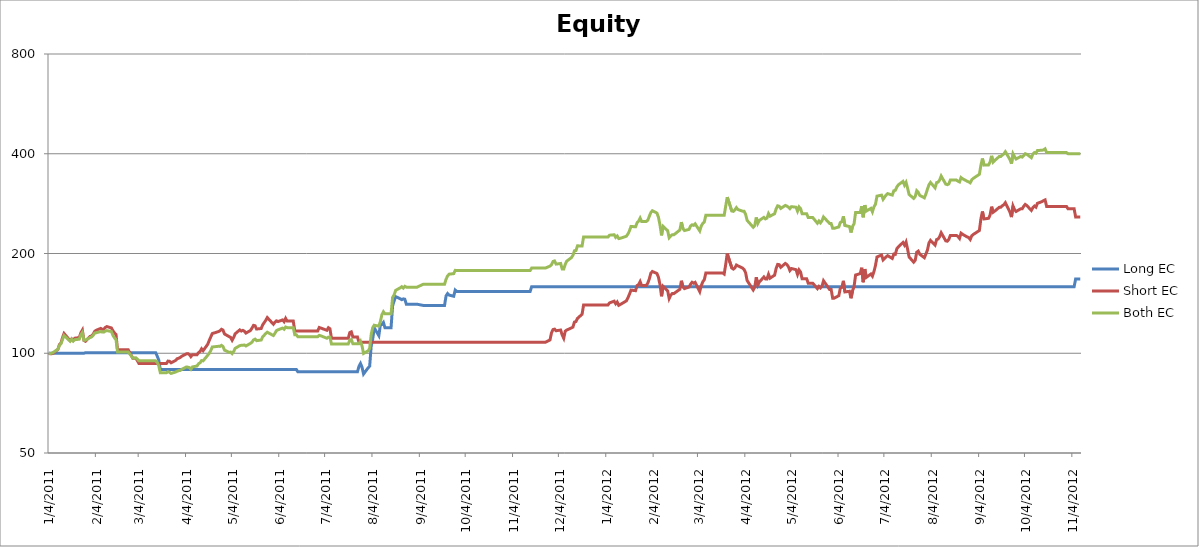
| Category | Long EC | Short EC | Both EC |
|---|---|---|---|
| 2011-01-04 | 100 | 100 | 100 |
| 2011-01-05 | 100 | 99.639 | 99.834 |
| 2011-01-06 | 100 | 99.675 | 100.065 |
| 2011-01-07 | 100 | 100.115 | 100.629 |
| 2011-01-10 | 100 | 102.716 | 102.89 |
| 2011-01-11 | 100 | 106.32 | 105.572 |
| 2011-01-12 | 100 | 107.437 | 106.851 |
| 2011-01-13 | 100 | 111.402 | 110.026 |
| 2011-01-14 | 100 | 114.733 | 113.123 |
| 2011-01-18 | 100 | 109.132 | 108.713 |
| 2011-01-19 | 100 | 110.538 | 110.254 |
| 2011-01-20 | 100 | 109.337 | 108.807 |
| 2011-01-21 | 100 | 111.011 | 109.857 |
| 2011-01-24 | 100 | 111.498 | 110.278 |
| 2011-01-25 | 100 | 115.309 | 113.622 |
| 2011-01-26 | 100 | 117.448 | 115.449 |
| 2011-01-27 | 100 | 109.354 | 109.508 |
| 2011-01-28 | 100.352 | 108.688 | 109.508 |
| 2011-01-31 | 100.352 | 112.401 | 111.503 |
| 2011-02-01 | 100.352 | 112.692 | 112.004 |
| 2011-02-02 | 100.352 | 114.077 | 113.132 |
| 2011-02-03 | 100.352 | 116.316 | 115.03 |
| 2011-02-04 | 100.352 | 117.295 | 115.279 |
| 2011-02-07 | 100.352 | 118.84 | 116.273 |
| 2011-02-08 | 100.352 | 118.113 | 115.825 |
| 2011-02-09 | 100.352 | 118.144 | 115.81 |
| 2011-02-10 | 100.352 | 119.668 | 116.615 |
| 2011-02-11 | 100.352 | 120.372 | 117.019 |
| 2011-02-14 | 100.352 | 119.232 | 116.283 |
| 2011-02-15 | 100.352 | 116.865 | 113.232 |
| 2011-02-16 | 100.352 | 115.23 | 111.315 |
| 2011-02-17 | 100.352 | 114.006 | 109.9 |
| 2011-02-18 | 100.352 | 102.388 | 100.902 |
| 2011-02-22 | 100.352 | 102.388 | 100.902 |
| 2011-02-23 | 100.352 | 102.388 | 100.902 |
| 2011-02-24 | 100.352 | 102.388 | 100.902 |
| 2011-02-25 | 100.352 | 102.388 | 100.902 |
| 2011-02-28 | 100.352 | 96.541 | 96.82 |
| 2011-03-01 | 100.352 | 96.541 | 96.82 |
| 2011-03-02 | 100.352 | 96.541 | 96.82 |
| 2011-03-03 | 100.352 | 95.003 | 96.007 |
| 2011-03-04 | 100.352 | 93.107 | 94.843 |
| 2011-03-07 | 100.352 | 93.107 | 94.843 |
| 2011-03-08 | 100.352 | 93.107 | 94.843 |
| 2011-03-09 | 100.352 | 93.107 | 94.843 |
| 2011-03-10 | 100.352 | 93.107 | 94.843 |
| 2011-03-11 | 100.352 | 93.107 | 94.843 |
| 2011-03-14 | 100.352 | 93.107 | 94.843 |
| 2011-03-15 | 100.352 | 93.107 | 94.843 |
| 2011-03-16 | 97.938 | 93.107 | 93.822 |
| 2011-03-17 | 95.34 | 93.107 | 91.668 |
| 2011-03-18 | 89.361 | 93.107 | 87.341 |
| 2011-03-21 | 89.361 | 93.107 | 87.341 |
| 2011-03-22 | 89.361 | 93.107 | 87.341 |
| 2011-03-23 | 89.361 | 94.689 | 87.991 |
| 2011-03-24 | 89.361 | 94.545 | 87.594 |
| 2011-03-25 | 89.361 | 93.59 | 86.922 |
| 2011-03-28 | 89.361 | 95.123 | 87.757 |
| 2011-03-29 | 89.361 | 96.273 | 88.214 |
| 2011-03-30 | 89.361 | 96.607 | 88.636 |
| 2011-03-31 | 89.361 | 97.099 | 88.715 |
| 2011-04-01 | 89.361 | 97.918 | 89.394 |
| 2011-04-04 | 89.361 | 99.575 | 90.914 |
| 2011-04-05 | 89.361 | 99.747 | 90.79 |
| 2011-04-06 | 89.361 | 99.179 | 90.504 |
| 2011-04-07 | 89.361 | 97.662 | 89.428 |
| 2011-04-08 | 89.361 | 98.992 | 90.917 |
| 2011-04-11 | 89.361 | 98.903 | 91.515 |
| 2011-04-12 | 89.361 | 100.443 | 92.947 |
| 2011-04-13 | 89.361 | 101.2 | 93.574 |
| 2011-04-14 | 89.361 | 103.132 | 95.023 |
| 2011-04-15 | 89.361 | 101.787 | 94.846 |
| 2011-04-18 | 89.361 | 106.399 | 98.604 |
| 2011-04-19 | 89.361 | 109.27 | 99.916 |
| 2011-04-20 | 89.361 | 111.947 | 101.853 |
| 2011-04-21 | 89.361 | 114.671 | 104.442 |
| 2011-04-25 | 89.361 | 116.217 | 104.947 |
| 2011-04-26 | 89.361 | 116.889 | 104.87 |
| 2011-04-27 | 89.361 | 118.129 | 105.639 |
| 2011-04-28 | 89.361 | 117.514 | 104.842 |
| 2011-04-29 | 89.361 | 114.341 | 102.178 |
| 2011-05-02 | 89.361 | 112.258 | 100.68 |
| 2011-05-03 | 89.361 | 111.65 | 100.8 |
| 2011-05-04 | 89.361 | 109.471 | 99.751 |
| 2011-05-05 | 89.361 | 111.589 | 101.234 |
| 2011-05-06 | 89.361 | 114.508 | 103.493 |
| 2011-05-09 | 89.361 | 117.619 | 105.425 |
| 2011-05-10 | 89.361 | 116.691 | 105.698 |
| 2011-05-11 | 89.361 | 117.228 | 105.681 |
| 2011-05-12 | 89.361 | 116.57 | 105.904 |
| 2011-05-13 | 89.361 | 115.047 | 105.188 |
| 2011-05-16 | 89.361 | 117.132 | 107.11 |
| 2011-05-17 | 89.361 | 119.12 | 107.974 |
| 2011-05-18 | 89.361 | 121.363 | 109.751 |
| 2011-05-19 | 89.361 | 121.035 | 110.329 |
| 2011-05-20 | 89.361 | 118.316 | 109.128 |
| 2011-05-23 | 89.361 | 118.765 | 109.636 |
| 2011-05-24 | 89.361 | 121.845 | 112.11 |
| 2011-05-25 | 89.361 | 123.781 | 113.376 |
| 2011-05-26 | 89.361 | 125.717 | 114.71 |
| 2011-05-27 | 89.361 | 128.129 | 115.723 |
| 2011-05-31 | 89.361 | 122.354 | 113.1 |
| 2011-06-01 | 89.361 | 124.092 | 114.83 |
| 2011-06-02 | 89.361 | 125.256 | 117.05 |
| 2011-06-03 | 89.361 | 124.61 | 117.688 |
| 2011-06-06 | 89.361 | 126.034 | 119.098 |
| 2011-06-07 | 89.361 | 124.501 | 118.154 |
| 2011-06-08 | 89.361 | 127.417 | 120.02 |
| 2011-06-09 | 89.361 | 125.063 | 119.468 |
| 2011-06-10 | 89.361 | 125.063 | 119.468 |
| 2011-06-13 | 89.361 | 125.063 | 119.468 |
| 2011-06-14 | 89.361 | 116.813 | 113.712 |
| 2011-06-15 | 89.361 | 116.813 | 113.712 |
| 2011-06-16 | 87.897 | 116.813 | 112.19 |
| 2011-06-17 | 87.897 | 116.813 | 112.19 |
| 2011-06-20 | 87.897 | 116.813 | 112.19 |
| 2011-06-21 | 87.897 | 116.813 | 112.19 |
| 2011-06-22 | 87.897 | 116.813 | 112.19 |
| 2011-06-23 | 87.897 | 116.813 | 112.19 |
| 2011-06-24 | 87.897 | 116.813 | 112.19 |
| 2011-06-27 | 87.897 | 116.813 | 112.19 |
| 2011-06-28 | 87.897 | 116.813 | 112.19 |
| 2011-06-29 | 87.897 | 116.813 | 112.19 |
| 2011-06-30 | 87.897 | 119.621 | 113.229 |
| 2011-07-01 | 87.897 | 119.155 | 112.884 |
| 2011-07-05 | 87.897 | 117.307 | 110.995 |
| 2011-07-06 | 87.897 | 119.429 | 111.854 |
| 2011-07-07 | 87.897 | 118.527 | 111.798 |
| 2011-07-08 | 87.897 | 110.947 | 106.673 |
| 2011-07-11 | 87.897 | 110.947 | 106.673 |
| 2011-07-12 | 87.897 | 110.947 | 106.673 |
| 2011-07-13 | 87.897 | 110.947 | 106.673 |
| 2011-07-14 | 87.897 | 110.947 | 106.673 |
| 2011-07-15 | 87.897 | 110.947 | 106.673 |
| 2011-07-18 | 87.897 | 110.947 | 106.673 |
| 2011-07-19 | 87.897 | 110.947 | 106.673 |
| 2011-07-20 | 87.897 | 115.484 | 109.557 |
| 2011-07-21 | 87.897 | 116.043 | 110.011 |
| 2011-07-22 | 87.897 | 112.037 | 106.827 |
| 2011-07-25 | 87.897 | 112.037 | 106.827 |
| 2011-07-26 | 91.297 | 107.915 | 106.827 |
| 2011-07-27 | 93.136 | 107.915 | 108.668 |
| 2011-07-28 | 90.768 | 107.915 | 105.168 |
| 2011-07-29 | 86.569 | 107.915 | 99.852 |
| 2011-08-01 | 90.371 | 107.915 | 101.69 |
| 2011-08-02 | 91.4 | 107.915 | 103.398 |
| 2011-08-03 | 105.095 | 107.915 | 114.043 |
| 2011-08-04 | 110.306 | 107.915 | 119.533 |
| 2011-08-05 | 119.275 | 107.915 | 121.464 |
| 2011-08-08 | 113.022 | 107.915 | 120.751 |
| 2011-08-09 | 121.643 | 107.915 | 124.621 |
| 2011-08-10 | 122.144 | 107.915 | 130.73 |
| 2011-08-11 | 123.841 | 107.915 | 133.427 |
| 2011-08-12 | 119.454 | 107.915 | 131.519 |
| 2011-08-15 | 119.454 | 107.915 | 131.519 |
| 2011-08-16 | 119.454 | 107.915 | 131.519 |
| 2011-08-17 | 138.999 | 107.915 | 147.362 |
| 2011-08-18 | 143.748 | 107.915 | 149.992 |
| 2011-08-19 | 148.241 | 107.915 | 154.803 |
| 2011-08-22 | 146.028 | 107.915 | 157.581 |
| 2011-08-23 | 145.123 | 107.915 | 158.828 |
| 2011-08-24 | 145.906 | 107.915 | 157.268 |
| 2011-08-25 | 145.56 | 107.915 | 159.173 |
| 2011-08-26 | 140.589 | 107.915 | 158.308 |
| 2011-08-29 | 140.589 | 107.915 | 158.308 |
| 2011-08-30 | 140.589 | 107.915 | 158.308 |
| 2011-08-31 | 140.589 | 107.915 | 158.308 |
| 2011-09-01 | 140.589 | 107.915 | 158.308 |
| 2011-09-02 | 140.589 | 107.915 | 158.308 |
| 2011-09-06 | 139.443 | 107.915 | 161.477 |
| 2011-09-07 | 139.443 | 107.915 | 161.477 |
| 2011-09-08 | 139.443 | 107.915 | 161.477 |
| 2011-09-09 | 139.443 | 107.915 | 161.477 |
| 2011-09-12 | 139.443 | 107.915 | 161.477 |
| 2011-09-13 | 139.443 | 107.915 | 161.477 |
| 2011-09-14 | 139.443 | 107.915 | 161.477 |
| 2011-09-15 | 139.443 | 107.915 | 161.477 |
| 2011-09-16 | 139.443 | 107.915 | 161.477 |
| 2011-09-19 | 139.443 | 107.915 | 161.477 |
| 2011-09-20 | 139.443 | 107.915 | 161.477 |
| 2011-09-21 | 149.007 | 107.915 | 167.334 |
| 2011-09-22 | 151.447 | 107.915 | 171.089 |
| 2011-09-23 | 149.775 | 107.915 | 173.264 |
| 2011-09-26 | 148.624 | 107.915 | 173.881 |
| 2011-09-27 | 155.082 | 107.915 | 177.885 |
| 2011-09-28 | 153.593 | 107.915 | 177.582 |
| 2011-09-29 | 153.593 | 107.915 | 177.582 |
| 2011-09-30 | 153.593 | 107.915 | 177.582 |
| 2011-10-03 | 153.593 | 107.915 | 177.582 |
| 2011-10-04 | 153.593 | 107.915 | 177.582 |
| 2011-10-05 | 153.593 | 107.915 | 177.582 |
| 2011-10-06 | 153.593 | 107.915 | 177.582 |
| 2011-10-07 | 153.593 | 107.915 | 177.582 |
| 2011-10-10 | 153.593 | 107.915 | 177.582 |
| 2011-10-11 | 153.593 | 107.915 | 177.582 |
| 2011-10-12 | 153.593 | 107.915 | 177.582 |
| 2011-10-13 | 153.593 | 107.915 | 177.582 |
| 2011-10-14 | 153.593 | 107.915 | 177.582 |
| 2011-10-17 | 153.593 | 107.915 | 177.582 |
| 2011-10-18 | 153.593 | 107.915 | 177.582 |
| 2011-10-19 | 153.593 | 107.915 | 177.582 |
| 2011-10-20 | 153.593 | 107.915 | 177.582 |
| 2011-10-21 | 153.593 | 107.915 | 177.582 |
| 2011-10-24 | 153.593 | 107.915 | 177.582 |
| 2011-10-25 | 153.593 | 107.915 | 177.582 |
| 2011-10-26 | 153.593 | 107.915 | 177.582 |
| 2011-10-27 | 153.593 | 107.915 | 177.582 |
| 2011-10-28 | 153.593 | 107.915 | 177.582 |
| 2011-10-31 | 153.593 | 107.915 | 177.582 |
| 2011-11-01 | 153.593 | 107.915 | 177.582 |
| 2011-11-02 | 153.593 | 107.915 | 177.582 |
| 2011-11-03 | 153.593 | 107.915 | 177.582 |
| 2011-11-04 | 153.593 | 107.915 | 177.582 |
| 2011-11-07 | 153.593 | 107.915 | 177.582 |
| 2011-11-08 | 153.593 | 107.915 | 177.582 |
| 2011-11-09 | 153.593 | 107.915 | 177.582 |
| 2011-11-10 | 153.593 | 107.915 | 177.582 |
| 2011-11-11 | 153.593 | 107.915 | 177.582 |
| 2011-11-14 | 153.593 | 107.915 | 177.582 |
| 2011-11-15 | 153.593 | 107.915 | 177.582 |
| 2011-11-16 | 158.768 | 107.915 | 180.744 |
| 2011-11-17 | 158.768 | 107.915 | 180.744 |
| 2011-11-18 | 158.768 | 107.915 | 180.744 |
| 2011-11-21 | 158.768 | 107.915 | 180.744 |
| 2011-11-22 | 158.768 | 107.915 | 180.744 |
| 2011-11-23 | 158.768 | 107.915 | 180.744 |
| 2011-11-25 | 158.768 | 107.915 | 180.744 |
| 2011-11-28 | 158.768 | 109.714 | 183.249 |
| 2011-11-29 | 158.768 | 115.266 | 184.975 |
| 2011-11-30 | 158.768 | 117.909 | 189.247 |
| 2011-12-01 | 158.768 | 118.217 | 189.911 |
| 2011-12-02 | 158.768 | 116.93 | 185.779 |
| 2011-12-05 | 158.768 | 117.492 | 186.611 |
| 2011-12-06 | 158.768 | 113.458 | 179.51 |
| 2011-12-07 | 158.768 | 110.969 | 179.507 |
| 2011-12-08 | 158.768 | 116.619 | 185.599 |
| 2011-12-09 | 158.768 | 117.519 | 189.738 |
| 2011-12-12 | 158.768 | 119.23 | 194.28 |
| 2011-12-13 | 158.768 | 119.882 | 197.405 |
| 2011-12-14 | 158.768 | 124.22 | 203.836 |
| 2011-12-15 | 158.768 | 124.653 | 204.24 |
| 2011-12-16 | 158.768 | 127.429 | 210.972 |
| 2011-12-19 | 158.768 | 131.088 | 210.657 |
| 2011-12-20 | 158.768 | 139.948 | 224.48 |
| 2011-12-21 | 158.768 | 139.948 | 224.48 |
| 2011-12-22 | 158.768 | 139.948 | 224.48 |
| 2011-12-23 | 158.768 | 139.948 | 224.48 |
| 2011-12-27 | 158.768 | 139.948 | 224.48 |
| 2011-12-28 | 158.768 | 139.948 | 224.48 |
| 2011-12-29 | 158.768 | 139.948 | 224.48 |
| 2011-12-30 | 158.768 | 139.948 | 224.48 |
| 2012-01-03 | 158.768 | 139.948 | 224.48 |
| 2012-01-04 | 158.768 | 139.948 | 224.48 |
| 2012-01-05 | 158.768 | 139.948 | 224.48 |
| 2012-01-06 | 158.768 | 141.931 | 227.125 |
| 2012-01-09 | 158.768 | 143.593 | 227.822 |
| 2012-01-10 | 158.768 | 141.031 | 223.633 |
| 2012-01-11 | 158.768 | 142.787 | 225.873 |
| 2012-01-12 | 158.768 | 139.528 | 221.885 |
| 2012-01-13 | 158.768 | 140.329 | 222.303 |
| 2012-01-17 | 158.768 | 143.924 | 225.538 |
| 2012-01-18 | 158.768 | 146.937 | 229.069 |
| 2012-01-19 | 158.768 | 150.709 | 234.1 |
| 2012-01-20 | 158.768 | 155.018 | 241.388 |
| 2012-01-23 | 158.768 | 154.447 | 240.779 |
| 2012-01-24 | 158.768 | 160.103 | 247.588 |
| 2012-01-25 | 158.768 | 161.111 | 250.417 |
| 2012-01-26 | 158.768 | 164.541 | 255.845 |
| 2012-01-27 | 158.768 | 160.057 | 249.759 |
| 2012-01-30 | 158.768 | 160.119 | 249.952 |
| 2012-01-31 | 158.768 | 162.842 | 252.001 |
| 2012-02-01 | 158.768 | 167.623 | 259.014 |
| 2012-02-02 | 158.768 | 174.393 | 265.848 |
| 2012-02-03 | 158.768 | 176.517 | 269.247 |
| 2012-02-06 | 158.768 | 174.057 | 264.824 |
| 2012-02-07 | 158.768 | 169.502 | 257.095 |
| 2012-02-08 | 158.768 | 160.896 | 243.734 |
| 2012-02-09 | 158.768 | 148.579 | 226.867 |
| 2012-02-10 | 158.768 | 159.248 | 241.477 |
| 2012-02-13 | 158.768 | 154.326 | 234.303 |
| 2012-02-14 | 158.768 | 146.279 | 223.194 |
| 2012-02-15 | 158.768 | 149.619 | 225.815 |
| 2012-02-16 | 158.768 | 151.398 | 227.895 |
| 2012-02-17 | 158.768 | 151.331 | 227.691 |
| 2012-02-21 | 158.768 | 155.994 | 235.453 |
| 2012-02-22 | 158.768 | 165.489 | 248.747 |
| 2012-02-23 | 158.768 | 158.602 | 237.841 |
| 2012-02-24 | 158.768 | 156.706 | 234.592 |
| 2012-02-27 | 158.768 | 158.418 | 236.478 |
| 2012-02-28 | 158.768 | 161.555 | 242.085 |
| 2012-02-29 | 158.768 | 163.786 | 244.173 |
| 2012-03-01 | 158.768 | 162.676 | 243.275 |
| 2012-03-02 | 158.768 | 163.698 | 245.792 |
| 2012-03-05 | 158.768 | 153.43 | 233.968 |
| 2012-03-06 | 158.768 | 159.889 | 242.178 |
| 2012-03-07 | 158.768 | 164.321 | 246.483 |
| 2012-03-08 | 158.768 | 166.761 | 249.194 |
| 2012-03-09 | 158.768 | 174.673 | 260.998 |
| 2012-03-12 | 158.768 | 174.673 | 260.998 |
| 2012-03-13 | 158.768 | 174.673 | 260.998 |
| 2012-03-14 | 158.768 | 174.673 | 260.998 |
| 2012-03-15 | 158.768 | 174.673 | 260.998 |
| 2012-03-16 | 158.768 | 174.673 | 260.998 |
| 2012-03-19 | 158.768 | 174.673 | 260.998 |
| 2012-03-20 | 158.768 | 174.673 | 260.998 |
| 2012-03-21 | 158.768 | 173.368 | 260.929 |
| 2012-03-22 | 158.768 | 185.425 | 278.242 |
| 2012-03-23 | 158.768 | 199.789 | 295.89 |
| 2012-03-26 | 158.768 | 180.812 | 268.693 |
| 2012-03-27 | 158.768 | 179.467 | 268.041 |
| 2012-03-28 | 158.768 | 180.971 | 270.73 |
| 2012-03-29 | 158.768 | 184.608 | 275.059 |
| 2012-03-30 | 158.768 | 183.558 | 271.481 |
| 2012-04-02 | 158.768 | 180.719 | 268.384 |
| 2012-04-03 | 158.768 | 178.916 | 268.376 |
| 2012-04-04 | 158.768 | 175.068 | 262.739 |
| 2012-04-05 | 158.768 | 165.813 | 251.794 |
| 2012-04-09 | 158.768 | 155.256 | 239.997 |
| 2012-04-10 | 158.768 | 158.371 | 242.867 |
| 2012-04-11 | 158.768 | 169.63 | 256.962 |
| 2012-04-12 | 158.768 | 160.774 | 246.596 |
| 2012-04-13 | 158.768 | 163.981 | 251.679 |
| 2012-04-16 | 158.768 | 169.928 | 257.076 |
| 2012-04-17 | 158.768 | 167.603 | 254.436 |
| 2012-04-18 | 158.768 | 167.45 | 255.837 |
| 2012-04-19 | 158.768 | 173.037 | 263.942 |
| 2012-04-20 | 158.768 | 168.48 | 259.214 |
| 2012-04-23 | 158.768 | 172.034 | 263.685 |
| 2012-04-24 | 158.768 | 180.373 | 272.857 |
| 2012-04-25 | 158.768 | 185.388 | 278.543 |
| 2012-04-26 | 158.768 | 185.094 | 277.659 |
| 2012-04-27 | 158.768 | 181.677 | 273.553 |
| 2012-04-30 | 158.768 | 186.64 | 279.325 |
| 2012-05-01 | 158.768 | 185.221 | 278.025 |
| 2012-05-02 | 158.768 | 182.536 | 276.116 |
| 2012-05-03 | 158.768 | 177.687 | 273.249 |
| 2012-05-04 | 158.768 | 180.201 | 276.914 |
| 2012-05-07 | 158.768 | 178.755 | 275.814 |
| 2012-05-08 | 158.768 | 172.944 | 268.481 |
| 2012-05-09 | 158.768 | 178.395 | 276.384 |
| 2012-05-10 | 158.768 | 175.803 | 273.211 |
| 2012-05-11 | 158.768 | 167.678 | 263.597 |
| 2012-05-14 | 158.768 | 167.678 | 263.597 |
| 2012-05-15 | 158.768 | 162.62 | 256.664 |
| 2012-05-16 | 158.768 | 162.62 | 256.664 |
| 2012-05-17 | 158.768 | 162.62 | 256.664 |
| 2012-05-18 | 158.768 | 162.62 | 256.664 |
| 2012-05-21 | 158.768 | 156.673 | 246.825 |
| 2012-05-22 | 158.768 | 159.157 | 250.607 |
| 2012-05-23 | 158.768 | 157.472 | 247.456 |
| 2012-05-24 | 158.768 | 159.354 | 251.226 |
| 2012-05-25 | 158.768 | 165.482 | 257.849 |
| 2012-05-29 | 158.768 | 155.688 | 246.331 |
| 2012-05-30 | 158.768 | 155.688 | 246.331 |
| 2012-05-31 | 158.768 | 146.654 | 238.247 |
| 2012-06-01 | 158.768 | 146.654 | 238.247 |
| 2012-06-04 | 158.768 | 149.179 | 240.545 |
| 2012-06-05 | 158.768 | 157.17 | 248.025 |
| 2012-06-06 | 158.768 | 158.084 | 249.314 |
| 2012-06-07 | 158.768 | 165.402 | 258.873 |
| 2012-06-08 | 158.768 | 153.146 | 242.972 |
| 2012-06-11 | 158.768 | 153.76 | 241.163 |
| 2012-06-12 | 158.768 | 146.544 | 231.384 |
| 2012-06-13 | 158.768 | 154.418 | 241.356 |
| 2012-06-14 | 158.768 | 159.009 | 246.066 |
| 2012-06-15 | 158.768 | 172.239 | 266.06 |
| 2012-06-18 | 158.768 | 173.874 | 266.017 |
| 2012-06-19 | 158.768 | 181.177 | 277.625 |
| 2012-06-20 | 158.768 | 163.817 | 257.245 |
| 2012-06-21 | 158.768 | 179.496 | 279.894 |
| 2012-06-22 | 158.768 | 169.388 | 268.623 |
| 2012-06-25 | 158.768 | 173.445 | 273.699 |
| 2012-06-26 | 158.768 | 170.874 | 267.183 |
| 2012-06-27 | 158.768 | 176.376 | 276.551 |
| 2012-06-28 | 158.768 | 184.029 | 281.641 |
| 2012-06-29 | 158.768 | 195.249 | 297.96 |
| 2012-07-02 | 158.768 | 197.884 | 300.029 |
| 2012-07-03 | 158.768 | 191.327 | 291.447 |
| 2012-07-05 | 158.768 | 195.42 | 300.446 |
| 2012-07-06 | 158.768 | 196.982 | 303.226 |
| 2012-07-09 | 158.768 | 193.264 | 300.138 |
| 2012-07-10 | 158.768 | 199.212 | 309.331 |
| 2012-07-11 | 158.768 | 198.854 | 310.282 |
| 2012-07-12 | 158.768 | 206.859 | 317.562 |
| 2012-07-13 | 158.768 | 209.483 | 322.343 |
| 2012-07-16 | 158.768 | 215.936 | 330.047 |
| 2012-07-17 | 158.768 | 212.055 | 321.682 |
| 2012-07-18 | 158.768 | 216.689 | 327.863 |
| 2012-07-19 | 158.768 | 206.367 | 315.237 |
| 2012-07-20 | 158.768 | 195.23 | 301.429 |
| 2012-07-23 | 158.768 | 188.312 | 293.328 |
| 2012-07-24 | 158.768 | 190.769 | 297.09 |
| 2012-07-25 | 158.768 | 201.781 | 309.334 |
| 2012-07-26 | 158.768 | 203.322 | 306.009 |
| 2012-07-27 | 158.768 | 198.972 | 299.462 |
| 2012-07-30 | 158.768 | 194.234 | 294.416 |
| 2012-07-31 | 158.768 | 199.272 | 302.311 |
| 2012-08-01 | 158.768 | 204.716 | 312.667 |
| 2012-08-02 | 158.768 | 215.201 | 322.47 |
| 2012-08-03 | 158.768 | 219.115 | 327.707 |
| 2012-08-06 | 158.768 | 212.1 | 315.587 |
| 2012-08-07 | 158.768 | 220.287 | 327.385 |
| 2012-08-08 | 158.768 | 221.212 | 328.479 |
| 2012-08-09 | 158.768 | 224.824 | 333.302 |
| 2012-08-10 | 158.768 | 230.97 | 342.579 |
| 2012-08-13 | 158.768 | 218.388 | 323.868 |
| 2012-08-14 | 158.768 | 217.821 | 322.657 |
| 2012-08-15 | 158.768 | 220.647 | 324.45 |
| 2012-08-16 | 158.768 | 226.807 | 333.072 |
| 2012-08-17 | 158.768 | 226.807 | 333.072 |
| 2012-08-20 | 158.768 | 226.807 | 333.072 |
| 2012-08-21 | 158.768 | 225.091 | 330.41 |
| 2012-08-22 | 158.768 | 222.084 | 328.712 |
| 2012-08-23 | 158.768 | 230.369 | 338.979 |
| 2012-08-24 | 158.768 | 228.534 | 336.206 |
| 2012-08-27 | 158.768 | 224.379 | 330.428 |
| 2012-08-28 | 158.768 | 223.553 | 328.954 |
| 2012-08-29 | 158.768 | 220.465 | 326.794 |
| 2012-08-30 | 158.768 | 226.114 | 333.599 |
| 2012-08-31 | 158.768 | 228.277 | 337.099 |
| 2012-09-04 | 158.768 | 234.664 | 346.819 |
| 2012-09-05 | 158.768 | 254.516 | 369.108 |
| 2012-09-06 | 158.768 | 267.784 | 386.93 |
| 2012-09-07 | 158.768 | 254.303 | 369.633 |
| 2012-09-10 | 158.768 | 255.355 | 370.127 |
| 2012-09-11 | 158.768 | 261.396 | 377.669 |
| 2012-09-12 | 158.768 | 276.868 | 394.263 |
| 2012-09-13 | 158.768 | 266.357 | 377.539 |
| 2012-09-14 | 158.768 | 268.362 | 381.669 |
| 2012-09-17 | 158.768 | 275.649 | 392.347 |
| 2012-09-18 | 158.768 | 275.812 | 392.364 |
| 2012-09-19 | 158.768 | 278.62 | 396.332 |
| 2012-09-20 | 158.768 | 280.777 | 399.562 |
| 2012-09-21 | 158.768 | 284.657 | 405.686 |
| 2012-09-24 | 158.768 | 266.601 | 384.27 |
| 2012-09-25 | 158.768 | 257.594 | 373.449 |
| 2012-09-26 | 158.768 | 278.221 | 399.834 |
| 2012-09-27 | 158.768 | 271.416 | 391.906 |
| 2012-09-28 | 158.768 | 267.829 | 385.692 |
| 2012-10-01 | 158.768 | 272.799 | 392.449 |
| 2012-10-02 | 158.768 | 272.797 | 390.844 |
| 2012-10-03 | 158.768 | 277.646 | 394.99 |
| 2012-10-04 | 158.768 | 281.241 | 400.077 |
| 2012-10-05 | 158.768 | 279.218 | 398.568 |
| 2012-10-08 | 158.768 | 269.839 | 389.12 |
| 2012-10-09 | 158.768 | 274.905 | 398.909 |
| 2012-10-10 | 158.768 | 278.118 | 403.349 |
| 2012-10-11 | 158.768 | 275.986 | 401.579 |
| 2012-10-12 | 158.768 | 283.493 | 409.157 |
| 2012-10-15 | 158.768 | 286.838 | 409.839 |
| 2012-10-16 | 158.768 | 288.853 | 410.859 |
| 2012-10-17 | 158.768 | 290.232 | 413.889 |
| 2012-10-18 | 158.768 | 277.426 | 403.206 |
| 2012-10-19 | 158.768 | 277.426 | 403.206 |
| 2012-10-22 | 158.768 | 277.426 | 403.206 |
| 2012-10-23 | 158.768 | 277.426 | 403.206 |
| 2012-10-24 | 158.768 | 277.426 | 403.206 |
| 2012-10-25 | 158.768 | 277.426 | 403.206 |
| 2012-10-26 | 158.768 | 277.426 | 403.206 |
| 2012-10-31 | 158.768 | 277.426 | 403.206 |
| 2012-11-01 | 158.768 | 272.849 | 400.139 |
| 2012-11-02 | 158.768 | 272.849 | 400.139 |
| 2012-11-05 | 158.768 | 272.849 | 400.139 |
| 2012-11-06 | 167.643 | 257.702 | 400.139 |
| 2012-11-07 | 167.643 | 257.702 | 400.139 |
| 2012-11-08 | 167.643 | 257.702 | 400.139 |
| 2012-11-09 | 167.643 | 257.702 | 400.139 |